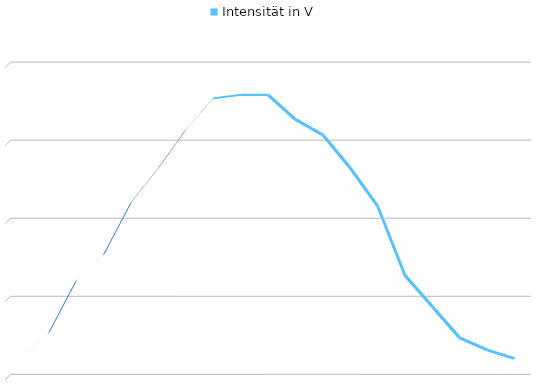
| Category | Intensität in V |
|---|---|
| -90 | 0.1 |
| -80 | 0.25 |
| -70 | 0.55 |
| -60 | 0.7 |
| -50 | 1 |
| -40 | 1.2 |
| -30 | 1.42 |
| -20 | 1.6 |
| -10 | 1.62 |
| 0 | 1.62 |
| 10 | 1.48 |
| 20 | 1.39 |
| 30 | 1.2 |
| 40 | 0.98 |
| 50 | 0.58 |
| 60 | 0.4 |
| 70 | 0.22 |
| 80 | 0.15 |
| 90 | 0.1 |